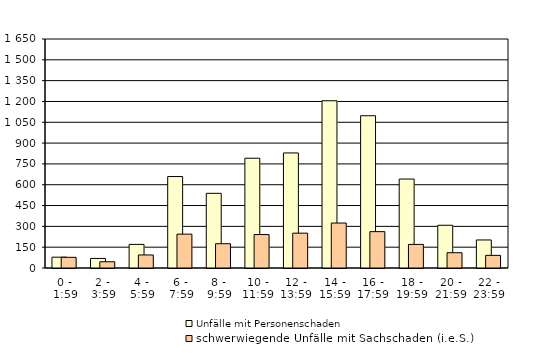
| Category |    Unfälle mit Personenschaden |    schwerwiegende Unfälle mit Sachschaden (i.e.S.)  |
|---|---|---|
| 0 | 78 | 77 |
| 1 | 69 | 45 |
| 2 | 170 | 94 |
| 3 | 659 | 244 |
| 4 | 538 | 175 |
| 5 | 791 | 241 |
| 6 | 829 | 251 |
| 7 | 1205 | 324 |
| 8 | 1097 | 262 |
| 9 | 641 | 170 |
| 10 | 308 | 110 |
| 11 | 202 | 91 |